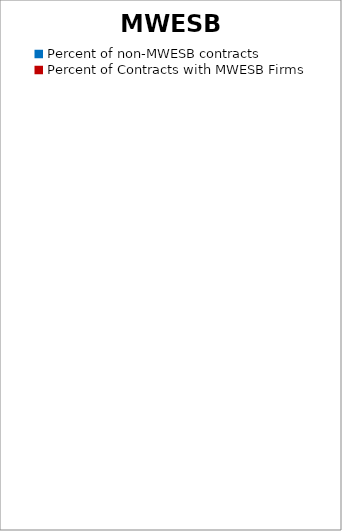
| Category | Series 0 |
|---|---|
| Percent of non-MWESB contracts | 0 |
| Percent of Contracts with MWESB Firms | 0 |